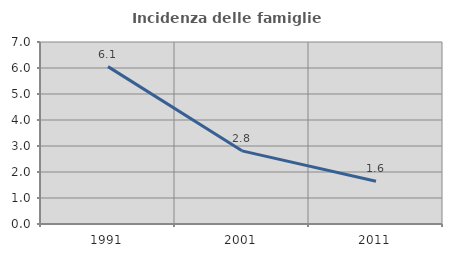
| Category | Incidenza delle famiglie numerose |
|---|---|
| 1991.0 | 6.054 |
| 2001.0 | 2.814 |
| 2011.0 | 1.641 |